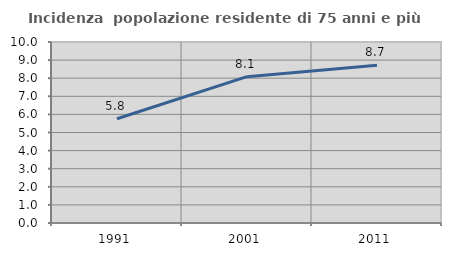
| Category | Incidenza  popolazione residente di 75 anni e più |
|---|---|
| 1991.0 | 5.758 |
| 2001.0 | 8.084 |
| 2011.0 | 8.715 |